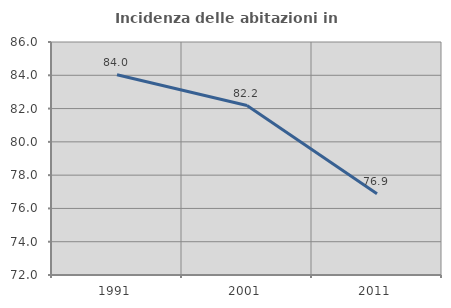
| Category | Incidenza delle abitazioni in proprietà  |
|---|---|
| 1991.0 | 84.031 |
| 2001.0 | 82.181 |
| 2011.0 | 76.886 |